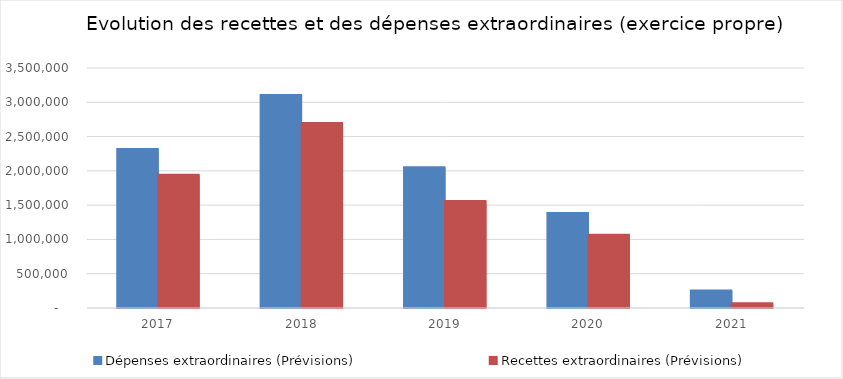
| Category | Dépenses extraordinaires (Prévisions) | Recettes extraordinaires (Prévisions) |
|---|---|---|
| 2017.0 | 2312304.11 | 1935818.79 |
| 2018.0 | 3100030.25 | 2689553.61 |
| 2019.0 | 2046187.23 | 1552104.45 |
| 2020.0 | 1378278.76 | 1059351.34 |
| 2021.0 | 247161.64 | 63714.87 |